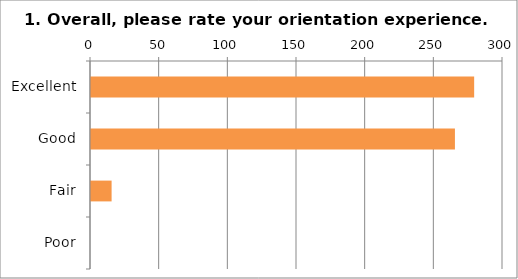
| Category | 1. Overall, please rate your orientation experience. |
|---|---|
| Excellent | 279 |
| Good | 265 |
| Fair | 15 |
| Poor | 0 |